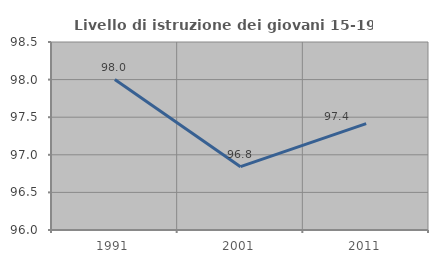
| Category | Livello di istruzione dei giovani 15-19 anni |
|---|---|
| 1991.0 | 98 |
| 2001.0 | 96.842 |
| 2011.0 | 97.414 |